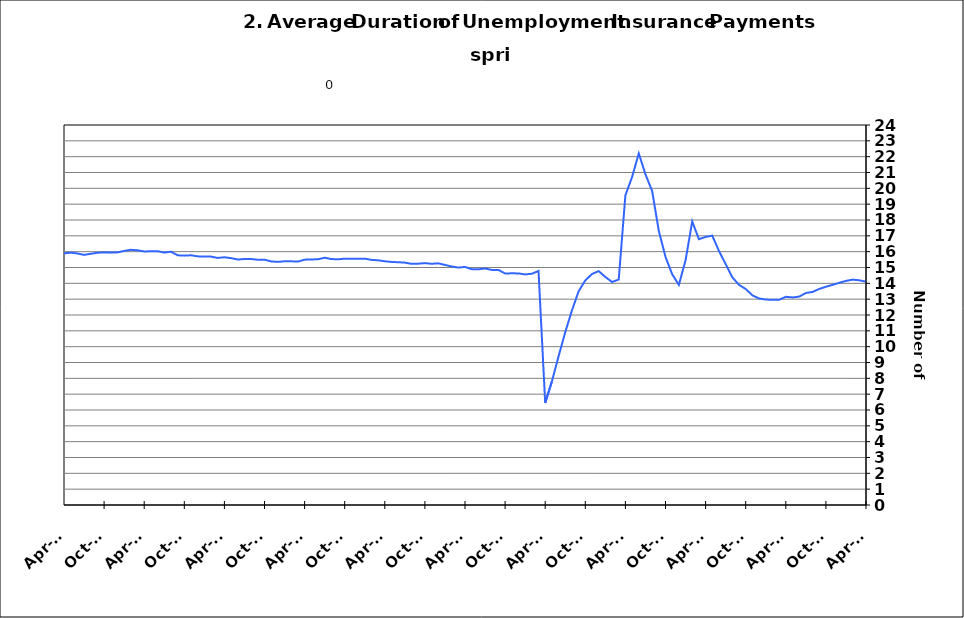
| Category | Average Duration |
|---|---|
| 1995-01-31 | 14.777 |
| 1995-02-28 | 14.761 |
| 1995-03-31 | 14.672 |
| 1995-04-30 | 14.601 |
| 1995-05-31 | 14.598 |
| 1995-06-30 | 14.51 |
| 1995-07-31 | 14.501 |
| 1995-08-31 | 14.41 |
| 1995-09-30 | 14.373 |
| 1995-10-31 | 14.393 |
| 1995-11-30 | 14.306 |
| 1995-12-31 | 14.23 |
| 1996-01-15 | 14.277 |
| 1996-02-15 | 14.204 |
| 1996-03-15 | 14.195 |
| 1996-04-15 | 14.116 |
| 1996-05-15 | 14.187 |
| 1996-06-15 | 14.214 |
| 1996-07-15 | 14.172 |
| 1996-08-15 | 14.174 |
| 1996-09-15 | 14.312 |
| 1996-10-15 | 14.308 |
| 1996-11-15 | 14.344 |
| 1996-12-15 | 14.461 |
| 1997-01-15 | 14.383 |
| 1997-02-15 | 14.413 |
| 1997-03-15 | 14.473 |
| 1997-04-15 | 14.518 |
| 1997-05-31 | 14.455 |
| 1997-06-30 | 14.38 |
| 1997-07-31 | 14.331 |
| 1997-08-31 | 14.279 |
| 1997-09-30 | 14.129 |
| 1997-10-31 | 14.07 |
| 1997-11-30 | 14.067 |
| 1997-12-31 | 13.993 |
| 1998-01-31 | 14.035 |
| 1998-02-28 | 14.047 |
| 1998-03-31 | 13.866 |
| 1998-04-30 | 13.764 |
| 1998-05-31 | 13.76 |
| 1998-06-30 | 13.675 |
| 1998-07-31 | 13.636 |
| 1998-08-31 | 13.558 |
| 1998-09-30 | 13.537 |
| 1998-10-31 | 13.462 |
| 1998-11-30 | 13.294 |
| 1998-12-31 | 13.16 |
| 1999-01-31 | 13.192 |
| 1999-02-28 | 13.297 |
| 1999-03-31 | 13.402 |
| 1999-04-30 | 13.443 |
| 1999-05-31 | 13.587 |
| 1999-06-30 | 13.74 |
| 1999-07-31 | 13.61 |
| 1999-08-31 | 13.717 |
| 1999-09-30 | 13.836 |
| 1999-10-31 | 14.032 |
| 1999-11-30 | 14.175 |
| 1999-12-31 | 14.303 |
| 2000-01-31 | 14.429 |
| 2000-02-29 | 14.376 |
| 2000-03-31 | 14.318 |
| 2000-04-30 | 14.352 |
| 2000-05-31 | 14.265 |
| 2000-06-30 | 14.174 |
| 2000-07-31 | 14.386 |
| 2000-08-31 | 14.362 |
| 2000-09-30 | 14.238 |
| 2000-10-31 | 14.236 |
| 2000-11-30 | 14.118 |
| 2000-12-31 | 14.004 |
| 2001-01-31 | 13.831 |
| 2001-02-28 | 13.708 |
| 2001-03-31 | 13.528 |
| 2001-04-30 | 13.376 |
| 2001-05-31 | 13.219 |
| 2001-06-30 | 13.171 |
| 2001-07-31 | 13.214 |
| 2001-08-31 | 13.157 |
| 2001-09-30 | 13.341 |
| 2001-10-31 | 13.178 |
| 2001-11-30 | 13.143 |
| 2001-12-31 | 13.4 |
| 2002-01-31 | 13.658 |
| 2002-02-28 | 13.952 |
| 2002-03-31 | 14.4 |
| 2002-04-30 | 14.946 |
| 2002-05-31 | 15.299 |
| 2002-06-30 | 15.677 |
| 2002-07-31 | 15.88 |
| 2002-08-31 | 16.087 |
| 2002-09-30 | 16.301 |
| 2002-10-31 | 16.624 |
| 2002-11-30 | 17.004 |
| 2002-12-31 | 17.229 |
| 2003-01-31 | 17.337 |
| 2003-02-28 | 17.359 |
| 2003-03-31 | 17.387 |
| 2003-04-30 | 17.118 |
| 2003-05-31 | 17.133 |
| 2003-06-30 | 17.187 |
| 2003-07-31 | 17.249 |
| 2003-08-31 | 17.486 |
| 2003-09-30 | 17.575 |
| 2003-10-31 | 17.651 |
| 2003-11-30 | 17.867 |
| 2003-12-31 | 17.897 |
| 2004-01-31 | 17.88 |
| 2004-02-29 | 17.995 |
| 2004-03-31 | 17.897 |
| 2004-04-30 | 17.828 |
| 2004-05-31 | 17.883 |
| 2004-06-30 | 17.577 |
| 2004-07-31 | 17.405 |
| 2004-08-31 | 17.207 |
| 2004-09-30 | 16.913 |
| 2004-10-31 | 16.869 |
| 2004-11-30 | 16.518 |
| 2004-12-31 | 16.342 |
| 2005-01-31 | 16.376 |
| 2005-02-28 | 16.223 |
| 2005-03-31 | 16.07 |
| 2005-04-30 | 15.951 |
| 2005-05-31 | 15.826 |
| 2005-06-30 | 15.815 |
| 2005-07-31 | 15.99 |
| 2005-08-31 | 15.796 |
| 2005-09-30 | 15.736 |
| 2005-10-31 | 15.703 |
| 2005-11-30 | 15.697 |
| 2005-12-31 | 15.583 |
| 2006-01-31 | 15.497 |
| 2006-02-28 | 15.415 |
| 2006-03-31 | 15.399 |
| 2006-04-30 | 15.663 |
| 2006-05-31 | 15.487 |
| 2006-06-30 | 15.333 |
| 2006-07-31 | 15.144 |
| 2006-08-31 | 14.91 |
| 2006-09-30 | 14.845 |
| 2006-10-31 | 14.766 |
| 2006-11-30 | 14.588 |
| 2006-12-31 | 14.585 |
| 2007-01-31 | 14.485 |
| 2007-02-28 | 14.412 |
| 2007-03-31 | 14.336 |
| 2007-04-30 | 14.26 |
| 2007-05-31 | 14.261 |
| 2007-06-30 | 14.479 |
| 2007-07-30 | 14.599 |
| 2007-08-31 | 14.843 |
| 2007-09-30 | 14.99 |
| 2007-10-31 | 15.008 |
| 2007-11-15 | 15.072 |
| 2007-12-15 09:36:00 | 15.095 |
| 2008-01-14 19:12:00 | 15.068 |
| 2008-02-14 04:48:00 | 15.026 |
| 2008-03-15 14:24:00 | 15.176 |
| 2008-04-15 | 15.005 |
| 2008-05-15 09:36:00 | 15.047 |
| 2008-06-14 19:12:00 | 15.073 |
| 2008-07-15 04:48:00 | 15.03 |
| 2008-08-14 14:24:00 | 15.17 |
| 2008-09-14 | 15.292 |
| 2008-10-14 09:36:00 | 15.161 |
| 2008-11-13 19:12:00 | 14.99 |
| 2008-12-14 04:48:00 | 14.905 |
| 2009-01-13 14:24:00 | 14.874 |
| 2009-02-13 | 14.935 |
| 2009-03-15 09:36:00 | 15.173 |
| 2009-04-14 19:12:00 | 15.519 |
| 2009-05-15 04:48:00 | 15.914 |
| 2009-06-14 14:24:00 | 16.348 |
| 2009-07-15 | 16.557 |
| 2009-08-14 09:36:00 | 16.984 |
| 2009-09-13 19:12:00 | 17.215 |
| 2009-10-14 04:48:00 | 17.535 |
| 2009-11-13 14:24:00 | 18.106 |
| 2009-12-14 | 18.54 |
| 2010-01-13 09:36:00 | 18.944 |
| 2010-02-12 19:12:00 | 19.336 |
| 2010-03-15 04:48:00 | 19.768 |
| 2010-04-14 14:24:00 | 19.926 |
| 2010-05-15 | 19.977 |
| 2010-06-14 09:36:00 | 19.94 |
| 2010-07-14 19:12:00 | 19.962 |
| 2010-08-14 04:48:00 | 19.819 |
| 2010-09-13 14:24:00 | 19.804 |
| 2010-10-14 | 19.667 |
| 2010-11-13 09:36:00 | 19.551 |
| 2010-12-13 19:12:00 | 19.477 |
| 2011-01-13 04:48:00 | 19.292 |
| 2011-02-12 14:24:00 | 19.125 |
| 2011-03-15 | 18.81 |
| 2011-04-14 09:36:00 | 18.639 |
| 2011-05-14 19:12:00 | 18.54 |
| 2011-06-14 04:48:00 | 18.288 |
| 2011-07-14 14:24:00 | 18.091 |
| 2011-08-14 | 17.932 |
| 2011-09-13 09:36:00 | 17.786 |
| 2011-10-13 19:12:00 | 17.884 |
| 2011-11-13 04:48:00 | 17.646 |
| 2011-12-13 14:24:00 | 17.586 |
| 2012-01-13 | 17.54 |
| 2012-02-12 09:36:00 | 17.456 |
| 2012-03-13 19:12:00 | 17.368 |
| 2012-04-13 04:48:00 | 17.381 |
| 2012-05-13 14:24:00 | 17.203 |
| 2012-06-13 | 17.23 |
| 2012-07-13 09:36:00 | 17.342 |
| 2012-08-12 19:12:00 | 17.231 |
| 2012-09-12 04:48:00 | 17.333 |
| 2012-10-12 14:24:00 | 17.279 |
| 2012-11-12 | 17.187 |
| 2012-12-12 09:36:00 | 17.098 |
| 2013-01-11 19:12:00 | 16.896 |
| 2013-02-11 04:48:00 | 16.83 |
| 2013-03-13 14:24:00 | 16.718 |
| 2013-04-13 | 16.663 |
| 2013-05-13 09:36:00 | 16.59 |
| 2013-06-12 19:12:00 | 16.673 |
| 2013-07-13 04:48:00 | 16.659 |
| 2013-08-12 14:24:00 | 16.466 |
| 2013-09-12 | 16.311 |
| 2013-10-12 09:36:00 | 16.144 |
| 2013-11-11 19:12:00 | 16.13 |
| 2013-12-12 04:48:00 | 16.048 |
| 2014-01-11 14:24:00 | 16.033 |
| 2014-02-11 | 15.962 |
| 2014-03-13 09:36:00 | 15.979 |
| 2014-04-12 19:12:00 | 15.897 |
| 2014-05-13 04:48:00 | 15.936 |
| 2014-06-12 14:24:00 | 15.888 |
| 2014-07-13 | 15.797 |
| 2014-08-12 09:36:00 | 15.865 |
| 2014-09-11 19:12:00 | 15.93 |
| 2014-10-12 04:48:00 | 15.956 |
| 2014-11-11 14:24:00 | 15.939 |
| 2014-12-12 | 15.955 |
| 2015-01-11 09:36:00 | 16.046 |
| 2015-02-10 19:12:00 | 16.117 |
| 2015-03-13 04:48:00 | 16.086 |
| 2015-04-12 14:24:00 | 16.014 |
| 2015-05-13 | 16.023 |
| 2015-06-12 09:36:00 | 16.033 |
| 2015-07-12 19:12:00 | 15.941 |
| 2015-08-12 04:48:00 | 15.997 |
| 2015-09-11 14:24:00 | 15.772 |
| 2015-10-12 | 15.749 |
| 2015-11-11 09:36:00 | 15.773 |
| 2015-12-11 19:12:00 | 15.704 |
| 2016-01-11 04:48:00 | 15.692 |
| 2016-02-10 14:24:00 | 15.687 |
| 2016-03-12 | 15.604 |
| 2016-04-11 09:36:00 | 15.646 |
| 2016-05-11 19:12:00 | 15.592 |
| 2016-06-11 04:48:00 | 15.504 |
| 2016-07-11 14:24:00 | 15.535 |
| 2016-08-11 | 15.535 |
| 2016-09-10 09:36:00 | 15.49 |
| 2016-10-10 19:12:00 | 15.491 |
| 2016-11-10 04:48:00 | 15.386 |
| 2016-12-10 14:24:00 | 15.355 |
| 2017-01-10 | 15.392 |
| 2017-02-09 09:36:00 | 15.391 |
| 2017-03-11 19:12:00 | 15.372 |
| 2017-04-11 04:48:00 | 15.495 |
| 2017-05-11 14:24:00 | 15.509 |
| 2017-06-11 | 15.518 |
| 2017-07-11 09:36:00 | 15.616 |
| 2017-08-10 19:12:00 | 15.534 |
| 2017-09-10 04:48:00 | 15.52 |
| 2017-10-10 14:24:00 | 15.554 |
| 2017-11-10 | 15.552 |
| 2017-12-10 09:36:00 | 15.547 |
| 2018-01-09 19:12:00 | 15.558 |
| 2018-02-09 04:48:00 | 15.483 |
| 2018-03-11 14:24:00 | 15.454 |
| 2018-04-11 | 15.393 |
| 2018-05-11 09:36:00 | 15.352 |
| 2018-06-10 19:12:00 | 15.333 |
| 2018-07-11 04:48:00 | 15.308 |
| 2018-08-10 14:24:00 | 15.231 |
| 2018-09-10 | 15.241 |
| 2018-10-10 09:36:00 | 15.277 |
| 2018-11-09 19:12:00 | 15.234 |
| 2018-12-10 04:48:00 | 15.264 |
| 2019-01-09 14:24:00 | 15.161 |
| 2019-02-09 | 15.064 |
| 2019-03-11 09:36:00 | 14.995 |
| 2019-04-10 19:12:00 | 15.036 |
| 2019-05-11 04:48:00 | 14.892 |
| 2019-06-10 14:24:00 | 14.889 |
| 2019-07-11 | 14.937 |
| 2019-08-10 09:36:00 | 14.848 |
| 2019-09-09 19:12:00 | 14.848 |
| 2019-10-10 04:48:00 | 14.621 |
| 2019-11-09 14:24:00 | 14.633 |
| 2019-12-10 | 14.625 |
| 2020-01-09 09:36:00 | 14.564 |
| 2020-02-08 19:12:00 | 14.605 |
| 2020-03-10 04:48:00 | 14.78 |
| 2020-04-09 14:24:00 | 6.442 |
| 2020-05-10 | 7.803 |
| 2020-06-09 09:36:00 | 9.393 |
| 2020-07-09 19:12:00 | 10.916 |
| 2020-08-09 04:48:00 | 12.288 |
| 2020-09-08 14:24:00 | 13.497 |
| 2020-10-09 | 14.182 |
| 2020-11-08 09:36:00 | 14.588 |
| 2020-12-08 19:12:00 | 14.772 |
| 2021-01-08 04:48:00 | 14.403 |
| 2021-02-07 14:24:00 | 14.084 |
| 2021-03-10 | 14.241 |
| 2021-04-09 09:36:00 | 19.558 |
| 2021-05-09 19:12:00 | 20.714 |
| 2021-06-09 04:48:00 | 22.207 |
| 2021-07-09 14:24:00 | 20.883 |
| 2021-08-09 | 19.835 |
| 2021-09-08 09:36:00 | 17.307 |
| 2021-10-08 19:12:00 | 15.672 |
| 2021-11-08 04:48:00 | 14.574 |
| 2021-12-08 14:24:00 | 13.901 |
| 2022-01-08 | 15.456 |
| 2022-02-07 09:36:00 | 17.909 |
| 2022-03-09 19:12:00 | 16.786 |
| 2022-04-09 04:48:00 | 16.931 |
| 2022-05-09 14:24:00 | 17.01 |
| 2022-06-09 | 16.045 |
| 2022-07-09 09:36:00 | 15.215 |
| 2022-08-08 19:12:00 | 14.379 |
| 2022-09-08 04:48:00 | 13.902 |
| 2022-10-08 14:24:00 | 13.644 |
| 2022-11-08 | 13.24 |
| 2022-12-08 09:36:00 | 13.043 |
| 2023-01-07 19:12:00 | 12.977 |
| 2023-02-07 04:48:00 | 12.956 |
| 2023-03-09 14:24:00 | 12.961 |
| 2023-04-09 | 13.15 |
| 2023-05-09 09:36:00 | 13.11 |
| 2023-06-08 19:12:00 | 13.161 |
| 2023-07-09 04:48:00 | 13.39 |
| 2023-08-08 14:24:00 | 13.455 |
| 2023-09-08 | 13.645 |
| 2023-10-08 09:36:00 | 13.783 |
| 2023-11-07 19:12:00 | 13.904 |
| 2023-12-08 04:48:00 | 14.035 |
| 2024-01-07 14:24:00 | 14.153 |
| 2024-02-07 | 14.234 |
| 2024-03-08 09:36:00 | 14.192 |
| 2024-04-07 19:12:00 | 14.103 |